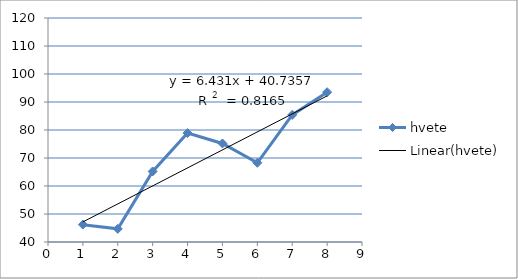
| Category | hvete |
|---|---|
| 1.0 | 46.2 |
| 2.0 | 44.7 |
| 3.0 | 65.2 |
| 4.0 | 78.9 |
| 5.0 | 75.2 |
| 6.0 | 68.3 |
| 7.0 | 85.4 |
| 8.0 | 93.5 |